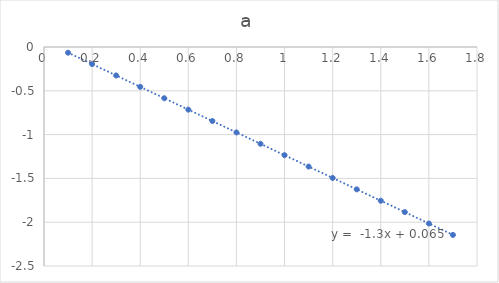
| Category | a |
|---|---|
| 0.1 | -0.065 |
| 0.2 | -0.195 |
| 0.3 | -0.325 |
| 0.4 | -0.455 |
| 0.5 | -0.585 |
| 0.6 | -0.715 |
| 0.7 | -0.845 |
| 0.8 | -0.975 |
| 0.9 | -1.105 |
| 1.0 | -1.235 |
| 1.1 | -1.365 |
| 1.2 | -1.495 |
| 1.3 | -1.625 |
| 1.4 | -1.755 |
| 1.5 | -1.885 |
| 1.6 | -2.015 |
| 1.7 | -2.145 |